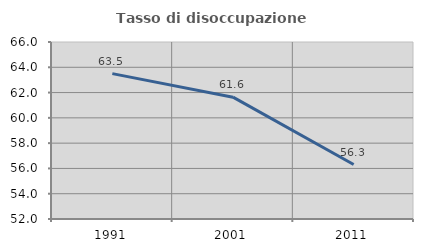
| Category | Tasso di disoccupazione giovanile  |
|---|---|
| 1991.0 | 63.501 |
| 2001.0 | 61.635 |
| 2011.0 | 56.307 |